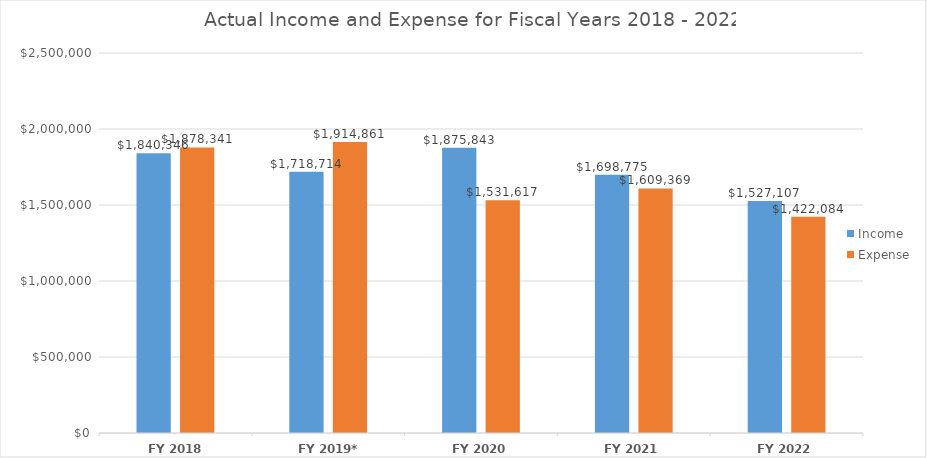
| Category | Income | Expense |
|---|---|---|
| FY 2018 * | 1840346 | 1878341 |
| FY 2019* | 1718714 | 1914861 |
| FY 2020 | 1875843 | 1531617 |
| FY 2021 | 1698775 | 1609369 |
| FY 2022 | 1527107 | 1422084 |